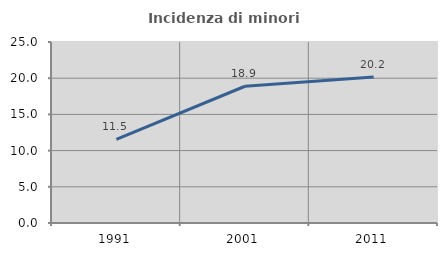
| Category | Incidenza di minori stranieri |
|---|---|
| 1991.0 | 11.538 |
| 2001.0 | 18.889 |
| 2011.0 | 20.175 |